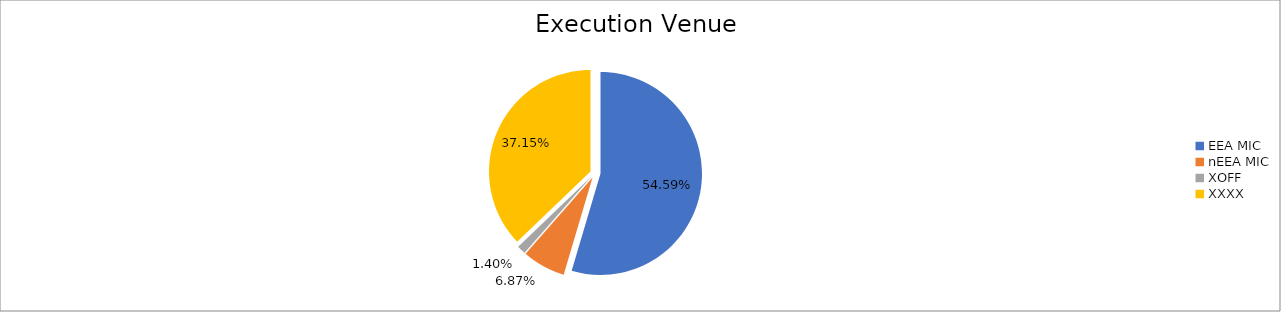
| Category | Series 0 |
|---|---|
| EEA MIC | 6337802.208 |
| nEEA MIC | 797651.339 |
| XOFF | 162342.583 |
| XXXX | 4312941.798 |